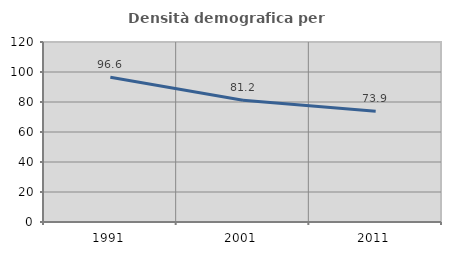
| Category | Densità demografica |
|---|---|
| 1991.0 | 96.566 |
| 2001.0 | 81.172 |
| 2011.0 | 73.874 |